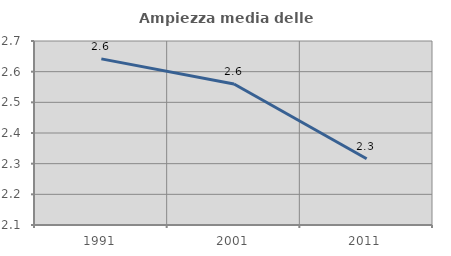
| Category | Ampiezza media delle famiglie |
|---|---|
| 1991.0 | 2.642 |
| 2001.0 | 2.56 |
| 2011.0 | 2.316 |